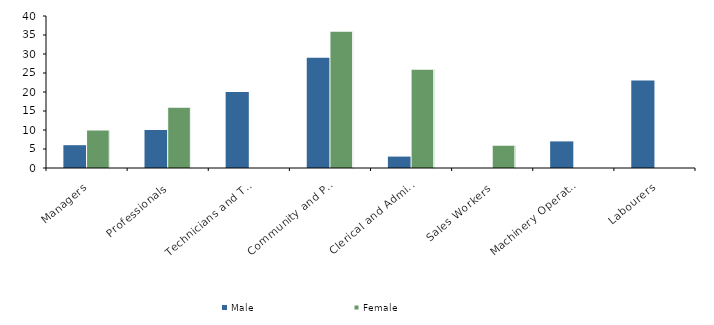
| Category | Male | Female |
|---|---|---|
| Managers | 6 | 10 |
| Professionals | 10 | 16 |
| Technicians and Trades Workers | 20 | 0 |
| Community and Personal Service Workers | 29 | 36 |
| Clerical and Administrative Workers | 3 | 26 |
| Sales Workers | 0 | 6 |
| Machinery Operators and Drivers | 7 | 0 |
| Labourers | 23 | 0 |